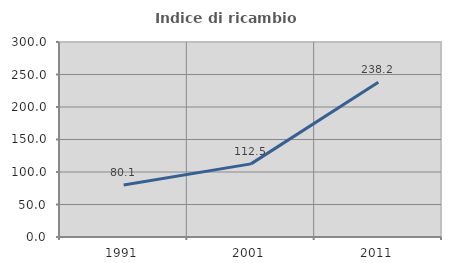
| Category | Indice di ricambio occupazionale  |
|---|---|
| 1991.0 | 80.075 |
| 2001.0 | 112.5 |
| 2011.0 | 238.158 |